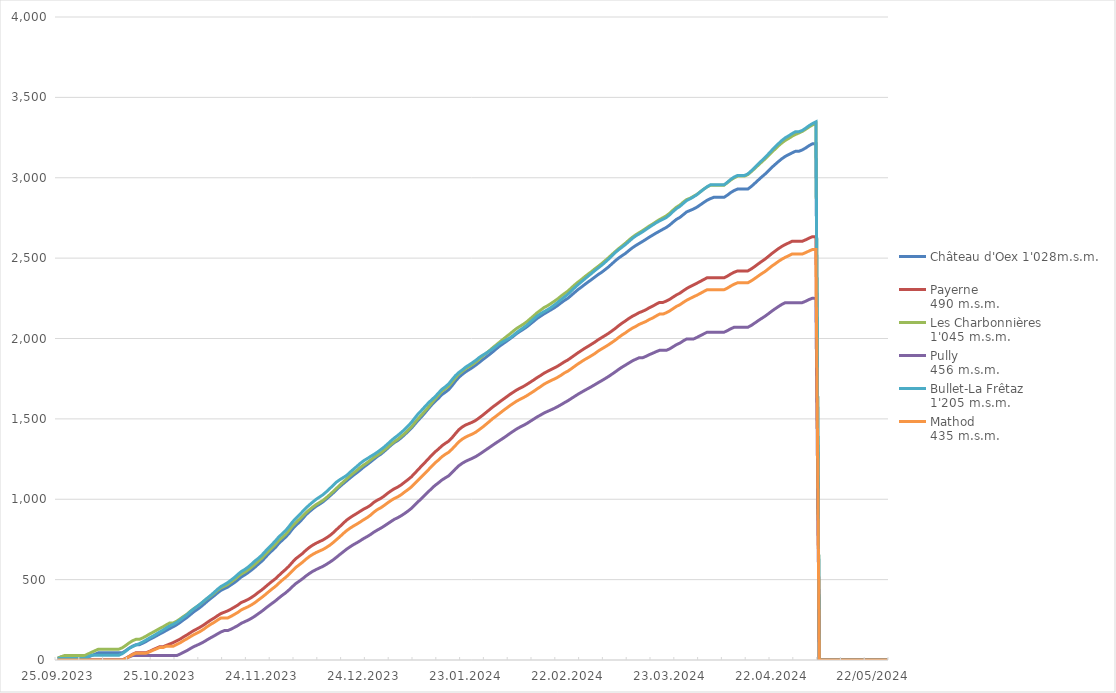
| Category | Château d'Oex 1'028m.s.m. | Payerne 
490 m.s.m. | Les Charbonnières 
1'045 m.s.m. | Pully 
456 m.s.m. | Bullet-La Frêtaz 
1'205 m.s.m. | Mathod 
435 m.s.m. |
|---|---|---|---|---|---|---|
| 25.09.2023 | 10.8 | 0 | 10.6 | 0 | 9.9 | 0 |
| 26.09.2023 | 19.4 | 0 | 19.9 | 0 | 9.9 | 0 |
| 27.09.2023 | 19.4 | 0 | 27.9 | 0 | 9.9 | 0 |
| 28.09.2023 | 19.4 | 0 | 27.9 | 0 | 9.9 | 0 |
| 29.09.2023 | 19.4 | 0 | 27.9 | 0 | 9.9 | 0 |
| 30.09.2023 | 19.4 | 0 | 27.9 | 0 | 9.9 | 0 |
| 01.10.2023 | 19.4 | 0 | 27.9 | 0 | 9.9 | 0 |
| 02.10.2023 | 19.4 | 0 | 27.9 | 0 | 9.9 | 0 |
| 03.10.2023 | 19.4 | 0 | 27.9 | 0 | 9.9 | 0 |
| 04.10.2023 | 19.4 | 0 | 38.4 | 0 | 20.1 | 0 |
| 05.10.2023 | 28.1 | 0 | 48.5 | 0 | 29.7 | 0 |
| 06.10.2023 | 36.7 | 0 | 58.1 | 0 | 29.7 | 0 |
| 07.10.2023 | 44.9 | 0 | 67.6 | 0 | 29.7 | 0 |
| 08.10.2023 | 44.9 | 0 | 67.6 | 0 | 29.7 | 0 |
| 09.10.2023 | 44.9 | 0 | 67.6 | 0 | 29.7 | 0 |
| 10.10.2023 | 44.9 | 0 | 67.6 | 0 | 29.7 | 0 |
| 11.10.2023 | 44.9 | 0 | 67.6 | 0 | 29.7 | 0 |
| 12.10.2023 | 44.9 | 0 | 67.6 | 0 | 29.7 | 0 |
| 13.10.2023 | 44.9 | 0 | 67.6 | 0 | 29.7 | 0 |
| 14.10.2023 | 44.9 | 0 | 76 | 0 | 39.4 | 0 |
| 15.10.2023 | 58.2 | 9.6 | 90.5 | 8.5 | 55 | 9 |
| 16.10.2023 | 73.2 | 22.5 | 106 | 19.1 | 71.7 | 20.8 |
| 17.10.2023 | 85.8 | 35.3 | 119.6 | 27.6 | 83.3 | 33.4 |
| 18.10.2023 | 95 | 45 | 128.4 | 27.6 | 92.9 | 42.3 |
| 19.10.2023 | 95 | 45 | 128.4 | 27.6 | 101.8 | 42.3 |
| 20.10.2023 | 104.3 | 45 | 137.3 | 27.6 | 112.2 | 42.3 |
| 21.10.2023 | 115.2 | 45 | 148.6 | 27.6 | 124.2 | 42.3 |
| 22.10.2023 | 128 | 53.7 | 161.3 | 27.6 | 137.3 | 50.9 |
| 23.10.2023 | 138.2 | 64.1 | 172.4 | 27.6 | 148.6 | 60.4 |
| 24.10.2023 | 149.7 | 73.2 | 184.1 | 27.6 | 161.2 | 68.8 |
| 25.10.2023 | 161.7 | 82.6 | 196.1 | 27.6 | 174.4 | 77.8 |
| 26.10.2023 | 172.6 | 82.6 | 206.7 | 27.6 | 186.3 | 77.8 |
| 27.10.2023 | 184.7 | 91.3 | 219.6 | 27.6 | 200.5 | 86 |
| 28.10.2023 | 196.2 | 99.8 | 230.9 | 27.6 | 212.7 | 86 |
| 29.10.2023 | 207.2 | 108.3 | 230.9 | 27.6 | 222.3 | 86 |
| 30.10.2023 | 219.2 | 119.4 | 241.4 | 27.6 | 234.1 | 96.4 |
| 31.10.2023 | 233.5 | 130.1 | 255.9 | 36.8 | 249.4 | 106.8 |
| 01.11.2023 | 249.7 | 143.5 | 270.9 | 47.8 | 265 | 120.1 |
| 02.11.2023 | 264.2 | 156 | 284.8 | 58.3 | 280.7 | 131.7 |
| 03.11.2023 | 281.8 | 169.6 | 302.9 | 70.9 | 299.9 | 144.8 |
| 04.11.2023 | 299.4 | 183.1 | 318.8 | 82.9 | 317.5 | 157.4 |
| 05.11.2023 | 313.8 | 193.9 | 333.1 | 92.2 | 333.1 | 167.6 |
| 06.11.2023 | 329.3 | 205.5 | 348.6 | 102.1 | 349.3 | 178.8 |
| 07.11.2023 | 347 | 218.7 | 366 | 113.3 | 367.3 | 192.4 |
| 08.11.2023 | 365.6 | 233.9 | 382.8 | 126.2 | 384.8 | 208 |
| 09.11.2023 | 382.7 | 248.2 | 397.8 | 138.4 | 402 | 221.9 |
| 10.11.2023 | 399.3 | 260.9 | 415 | 149.8 | 420.3 | 234 |
| 11.11.2023 | 417 | 275.2 | 433.6 | 162.3 | 440 | 248.1 |
| 12.11.2023 | 432.9 | 288.9 | 448.8 | 174.2 | 456.9 | 261.2 |
| 13.11.2023 | 443.8 | 297.2 | 459.2 | 182.8 | 468.9 | 261.2 |
| 14.11.2023 | 453.4 | 305.6 | 470 | 182.8 | 481.5 | 261.2 |
| 15.11.2023 | 467.7 | 316.9 | 485.5 | 192.1 | 497.5 | 271.8 |
| 16.11.2023 | 481.8 | 329.2 | 500.8 | 203 | 513.8 | 284.1 |
| 17.11.2023 | 498.4 | 342 | 518.5 | 214.4 | 532.8 | 296.3 |
| 18.11.2023 | 516.8 | 357.8 | 535.4 | 228.3 | 550.5 | 311.7 |
| 19.11.2023 | 529.4 | 366.4 | 546.7 | 238.2 | 562.7 | 321.8 |
| 20.11.2023 | 543.7 | 376.6 | 560.9 | 247.8 | 578.2 | 331.4 |
| 21.11.2023 | 560 | 389.2 | 577.7 | 259.4 | 596.2 | 343.2 |
| 22.11.2023 | 577.1 | 403.8 | 595.5 | 272.7 | 615.8 | 356.6 |
| 23.11.2023 | 596.2 | 420.6 | 614.4 | 287.9 | 632.4 | 373.1 |
| 24.11.2023 | 614.2 | 435.7 | 632.9 | 302.7 | 651.4 | 388.8 |
| 25.11.2023 | 636.1 | 453.4 | 655.1 | 319.5 | 674.6 | 405.6 |
| 26.11.2023 | 659.6 | 471.5 | 677 | 336.1 | 697.2 | 423.7 |
| 27.11.2023 | 679.6 | 488.5 | 697.6 | 351.7 | 718.3 | 441 |
| 28.11.2023 | 699.2 | 504.9 | 718.4 | 367.1 | 740.3 | 457.1 |
| 29.11.2023 | 724.5 | 524.8 | 742.7 | 385 | 764.8 | 476.9 |
| 30.11.2023 | 744.4 | 544.5 | 761.8 | 401.7 | 784.6 | 495.8 |
| 01.12.2023 | 763.8 | 562.9 | 781.2 | 417.1 | 804.6 | 513.1 |
| 02.12.2023 | 786.1 | 583.2 | 805.1 | 435.5 | 829.7 | 532 |
| 03.12.2023 | 813.9 | 607.4 | 832.7 | 455.8 | 857.2 | 554.1 |
| 04.12.2023 | 836.8 | 629.8 | 854 | 474.9 | 880.5 | 575.4 |
| 05.12.2023 | 856 | 646.1 | 873.7 | 489.9 | 901.4 | 591.6 |
| 06.12.2023 | 878.1 | 662.5 | 894 | 505.1 | 923.1 | 608.1 |
| 07.12.2023 | 902.9 | 682.7 | 916.1 | 522.4 | 945.3 | 626.7 |
| 08.12.2023 | 922.1 | 700 | 934.1 | 537.8 | 964.3 | 643.3 |
| 09.12.2023 | 939.8 | 714.5 | 951.2 | 551.4 | 982.5 | 656.9 |
| 10.12.2023 | 956.4 | 726.6 | 966.9 | 562.6 | 999.4 | 668.4 |
| 11.12.2023 | 969 | 736.8 | 979.6 | 572.7 | 1013.8 | 678.1 |
| 12.12.2023 | 983.4 | 746.4 | 992.3 | 582.4 | 1028 | 687.4 |
| 13.12.2023 | 1000.9 | 759.5 | 1009.4 | 594.7 | 1046.2 | 699.8 |
| 14.12.2023 | 1019.5 | 773.7 | 1028.2 | 608.2 | 1065.9 | 713.6 |
| 15.12.2023 | 1038.6 | 790.9 | 1047.7 | 622.6 | 1086.6 | 730.3 |
| 16.12.2023 | 1059.8 | 811.3 | 1067.9 | 639.3 | 1106.9 | 748.8 |
| 17.12.2023 | 1079.1 | 830.7 | 1087.8 | 656.5 | 1122 | 767.3 |
| 18.12.2023 | 1097.2 | 850.9 | 1108 | 673.1 | 1134.9 | 787 |
| 19.12.2023 | 1114.7 | 870.5 | 1127 | 689.8 | 1148.5 | 805.2 |
| 20.12.2023 | 1132.5 | 885.7 | 1146 | 704.4 | 1168.4 | 820.2 |
| 21.12.2023 | 1149.6 | 899.4 | 1163.4 | 717.8 | 1186.8 | 833.6 |
| 22.12.2023 | 1165.4 | 912.1 | 1179.9 | 729.5 | 1204.6 | 845.7 |
| 23.12.2023 | 1182.4 | 925.7 | 1197.8 | 742.3 | 1223.5 | 858.9 |
| 24.12.2023 | 1200.4 | 938.6 | 1213 | 755.9 | 1239.6 | 872.8 |
| 25.12.2023 | 1215.5 | 949.3 | 1227.3 | 767.5 | 1252.3 | 885.6 |
| 26.12.2023 | 1232.3 | 962.7 | 1243.7 | 780.5 | 1266.2 | 901 |
| 27.12.2023 | 1249.1 | 981.1 | 1260.4 | 795.5 | 1278.9 | 919.9 |
| 28.12.2023 | 1265.9 | 994.1 | 1274.2 | 808.2 | 1292.6 | 935.4 |
| 29.12.2023 | 1279.7 | 1005.2 | 1288.6 | 819.8 | 1308.3 | 946.8 |
| 30.12.2023 | 1297.2 | 1019.4 | 1305.5 | 832.9 | 1324.7 | 961.1 |
| 31.12.2023 | 1315.8 | 1036.7 | 1322.5 | 847.1 | 1343.3 | 977 |
| 01.01.2024 | 1335.6 | 1051.6 | 1341.5 | 861.2 | 1362.9 | 991.8 |
| 02.01.2024 | 1352.3 | 1065.4 | 1358.4 | 875.1 | 1380.9 | 1004.8 |
| 03.01.2024 | 1365.2 | 1075.8 | 1373.1 | 885.1 | 1396.7 | 1014.7 |
| 04.01.2024 | 1381.7 | 1089.1 | 1390.5 | 897.1 | 1414.8 | 1028 |
| 05.01.2024 | 1400.9 | 1105.5 | 1408.3 | 911 | 1433.5 | 1044.3 |
| 06.01.2024 | 1421 | 1121.7 | 1428.6 | 926.1 | 1455 | 1059.7 |
| 07.01.2024 | 1441.4 | 1139.2 | 1449.7 | 942.7 | 1477.3 | 1076.1 |
| 08.01.2024 | 1466 | 1161.4 | 1475.6 | 963.9 | 1504.5 | 1097.6 |
| 09.01.2024 | 1490.8 | 1184 | 1501.4 | 984.7 | 1531.1 | 1119.4 |
| 10.01.2024 | 1512.9 | 1206.6 | 1524 | 1004.4 | 1552.8 | 1140.5 |
| 11.01.2024 | 1537.1 | 1228.4 | 1548.7 | 1025.2 | 1576.1 | 1161.2 |
| 12.01.2024 | 1562.8 | 1251 | 1572.4 | 1046.4 | 1598.6 | 1182.7 |
| 13.01.2024 | 1587 | 1273.4 | 1598.6 | 1067 | 1619.2 | 1205.3 |
| 14.01.2024 | 1608.7 | 1294.7 | 1624.2 | 1086.5 | 1637.8 | 1226.7 |
| 15.01.2024 | 1628.7 | 1312.2 | 1646.9 | 1102.4 | 1661.3 | 1244.2 |
| 16.01.2024 | 1650.9 | 1332.5 | 1672.2 | 1119.7 | 1683.8 | 1264.3 |
| 17.01.2024 | 1665.7 | 1347.8 | 1687 | 1133 | 1699.6 | 1279.5 |
| 18.01.2024 | 1682.1 | 1361.3 | 1704 | 1145.9 | 1718 | 1292.2 |
| 19.01.2024 | 1706.8 | 1383.3 | 1729.4 | 1166.5 | 1744.5 | 1312.2 |
| 20.01.2024 | 1734.5 | 1408.7 | 1755.4 | 1189 | 1769.4 | 1334.8 |
| 21.01.2024 | 1758.5 | 1432.9 | 1779.3 | 1208.7 | 1788.7 | 1357.3 |
| 22.01.2024 | 1776.8 | 1449.7 | 1795.6 | 1223.9 | 1804.5 | 1374.2 |
| 23.01.2024 | 1793.1 | 1462.4 | 1812.5 | 1236.2 | 1822.1 | 1386.9 |
| 24.01.2024 | 1806.1 | 1470.9 | 1825.4 | 1245.8 | 1835.7 | 1396.9 |
| 25.01.2024 | 1819.9 | 1479.8 | 1838.7 | 1255.1 | 1849.9 | 1406 |
| 26.01.2024 | 1835.1 | 1491.3 | 1854 | 1266.1 | 1864.8 | 1417.9 |
| 27.01.2024 | 1851.2 | 1506.7 | 1872.2 | 1279.2 | 1882.4 | 1433.4 |
| 28.01.2024 | 1868.3 | 1522.7 | 1890.6 | 1293.6 | 1896 | 1449 |
| 29.01.2024 | 1884.2 | 1540 | 1907.3 | 1308.2 | 1908.6 | 1466.5 |
| 30.01.2024 | 1900.6 | 1557.3 | 1925.2 | 1322.5 | 1922.3 | 1484.1 |
| 31.01.2024 | 1917.6 | 1574.7 | 1943.7 | 1337.3 | 1936.5 | 1502.5 |
| 01.02.2024 | 1935.6 | 1589.9 | 1960.7 | 1351.7 | 1952.8 | 1518 |
| 02.02.2024 | 1952.9 | 1606 | 1978 | 1365.5 | 1968.5 | 1534.6 |
| 03.02.2024 | 1967.8 | 1621.4 | 1995.4 | 1379.3 | 1980.4 | 1551 |
| 04.02.2024 | 1982.7 | 1636.6 | 2012 | 1393.8 | 1992.2 | 1566.6 |
| 05.02.2024 | 1997.8 | 1652.3 | 2028.5 | 1409.3 | 2003.8 | 1582.3 |
| 06.02.2024 | 2013.6 | 1666.1 | 2046.5 | 1423.3 | 2019.4 | 1596.7 |
| 07.02.2024 | 2030.7 | 1679.9 | 2062.8 | 1437.4 | 2037.4 | 1610.6 |
| 08.02.2024 | 2044.7 | 1691.2 | 2076.1 | 1449.2 | 2052.6 | 1621.9 |
| 09.02.2024 | 2058.2 | 1702 | 2089.4 | 1459.7 | 2067.4 | 1632.5 |
| 10.02.2024 | 2072.8 | 1714.7 | 2104.6 | 1471.5 | 2083.1 | 1644.5 |
| 11.02.2024 | 2089.8 | 1728.4 | 2123 | 1485.1 | 2102.6 | 1658.1 |
| 12.02.2024 | 2106.9 | 1742 | 2141.2 | 1498.5 | 2121.5 | 1671.5 |
| 13.02.2024 | 2124.5 | 1756.8 | 2159.9 | 1512 | 2139.8 | 1686.4 |
| 14.02.2024 | 2138.9 | 1769.5 | 2175.7 | 1523.7 | 2153.7 | 1700.2 |
| 15.02.2024 | 2152.7 | 1783.8 | 2192 | 1535.8 | 2166.4 | 1715.4 |
| 16.02.2024 | 2165 | 1795 | 2203.1 | 1545.9 | 2178 | 1726.7 |
| 17.02.2024 | 2177.7 | 1806 | 2216.6 | 1555.2 | 2191.8 | 1737.6 |
| 18.02.2024 | 2190.1 | 1816.3 | 2230.8 | 1564.8 | 2207 | 1747.4 |
| 19.02.2024 | 2204.6 | 1827.4 | 2245.6 | 1575.7 | 2223.1 | 1758.1 |
| 20.02.2024 | 2221.1 | 1840.7 | 2262.9 | 1587.7 | 2241.5 | 1770.7 |
| 21.02.2024 | 2236.3 | 1854.4 | 2278.9 | 1600.4 | 2257.6 | 1785.4 |
| 22.02.2024 | 2249.4 | 1866 | 2294 | 1612.1 | 2274.3 | 1796.4 |
| 23.02.2024 | 2267.3 | 1880.7 | 2313.3 | 1625.9 | 2294.7 | 1810.9 |
| 24.02.2024 | 2285.9 | 1895.7 | 2332.6 | 1639.4 | 2314.9 | 1826.3 |
| 25.02.2024 | 2303.9 | 1910.9 | 2350.3 | 1653 | 2334.1 | 1841.6 |
| 26.02.2024 | 2319.3 | 1924.6 | 2366.3 | 1665.3 | 2352 | 1855.3 |
| 27.02.2024 | 2335.9 | 1938.7 | 2384 | 1677.3 | 2369.9 | 1869 |
| 28.02.2024 | 2351.6 | 1951.3 | 2400.4 | 1688.8 | 2387.7 | 1880.8 |
| 29.02.2024 | 2366.5 | 1964.4 | 2416.1 | 1700.6 | 2404.9 | 1893.3 |
| 01.03.2024 | 2382.6 | 1977.8 | 2433.5 | 1713 | 2422.7 | 1906.5 |
| 02.03.2024 | 2398.4 | 1992.9 | 2449.3 | 1725.7 | 2439.6 | 1922.3 |
| 03.03.2024 | 2412.1 | 2005.7 | 2466.2 | 1737.6 | 2455.7 | 1935.3 |
| 04.03.2024 | 2428.4 | 2018.6 | 2484.2 | 1750.4 | 2474.3 | 1947.8 |
| 05.03.2024 | 2445.3 | 2032 | 2502.6 | 1763.5 | 2493.5 | 1961 |
| 06.03.2024 | 2464.3 | 2046.8 | 2522 | 1777.8 | 2514 | 1975.2 |
| 07.03.2024 | 2483.4 | 2062.6 | 2540.8 | 1792.4 | 2534.8 | 1990 |
| 08.03.2024 | 2500.8 | 2080 | 2559.4 | 1808 | 2552.6 | 2006.7 |
| 09.03.2024 | 2515.3 | 2095.5 | 2576.1 | 1822.1 | 2568.5 | 2022.1 |
| 10.03.2024 | 2529.4 | 2109.7 | 2593.3 | 1834.6 | 2585.1 | 2035.5 |
| 11.03.2024 | 2547.1 | 2124.7 | 2612.2 | 1847.8 | 2603.5 | 2050.9 |
| 12.03.2024 | 2563.8 | 2138 | 2629.7 | 1860.4 | 2622.2 | 2064 |
| 13.03.2024 | 2578.3 | 2148.9 | 2644.8 | 1870.7 | 2637.9 | 2075 |
| 14.03.2024 | 2590.9 | 2160.8 | 2658.1 | 1879.9 | 2650.4 | 2087.5 |
| 15.03.2024 | 2603.5 | 2169 | 2670.8 | 1879.9 | 2663.2 | 2096.8 |
| 16.03.2024 | 2616.7 | 2178.7 | 2685.1 | 1888.9 | 2677.9 | 2105.8 |
| 17.03.2024 | 2630.5 | 2191.2 | 2699.7 | 1899.5 | 2692.2 | 2118.2 |
| 18.03.2024 | 2643.1 | 2201.3 | 2712.3 | 1908.4 | 2705.9 | 2127.4 |
| 19.03.2024 | 2655.8 | 2213.4 | 2726.5 | 1918 | 2719.7 | 2140.1 |
| 20.03.2024 | 2667.7 | 2224.4 | 2739.8 | 1926.4 | 2731.2 | 2151.7 |
| 21.03.2024 | 2679.4 | 2224.4 | 2751.2 | 1926.4 | 2741.9 | 2151.7 |
| 22.03.2024 | 2691 | 2232.7 | 2763.3 | 1926.4 | 2752.8 | 2160.3 |
| 23.03.2024 | 2705.9 | 2243.5 | 2779.5 | 1935.8 | 2769.5 | 2171.5 |
| 24.03.2024 | 2724.3 | 2257.6 | 2799 | 1948.8 | 2790 | 2185.7 |
| 25.03.2024 | 2741.5 | 2271.4 | 2817 | 1961.9 | 2808.5 | 2199.9 |
| 26.03.2024 | 2753.2 | 2282 | 2830.1 | 1971.5 | 2821.9 | 2210.1 |
| 27.03.2024 | 2770.4 | 2297.1 | 2848.4 | 1985.6 | 2840.9 | 2224.7 |
| 28.03.2024 | 2787.7 | 2311.2 | 2864.3 | 1997.1 | 2858.3 | 2238.1 |
| 29.03.2024 | 2796.6 | 2322.9 | 2872.5 | 1997.1 | 2868.9 | 2249.1 |
| 30.03.2024 | 2805.6 | 2333.4 | 2884.5 | 1997.1 | 2881.1 | 2259.4 |
| 31.03.2024 | 2817 | 2344 | 2896.7 | 2006.6 | 2894.6 | 2269.3 |
| 01.04.2024 | 2831.3 | 2355.1 | 2912.9 | 2017.7 | 2911.9 | 2280.5 |
| 02.04.2024 | 2846.1 | 2366.6 | 2929 | 2028.6 | 2928.5 | 2292.2 |
| 03.04.2024 | 2860 | 2377.8 | 2943 | 2039.2 | 2944.1 | 2303.5 |
| 04.04.2024 | 2870.3 | 2377.8 | 2954 | 2039.2 | 2956.1 | 2303.5 |
| 05.04.2024 | 2878.5 | 2377.8 | 2954 | 2039.2 | 2956.1 | 2303.5 |
| 06.04.2024 | 2878.5 | 2377.8 | 2954 | 2039.2 | 2956.1 | 2303.5 |
| 07.04.2024 | 2878.5 | 2377.8 | 2954 | 2039.2 | 2956.1 | 2303.5 |
| 08.04.2024 | 2878.5 | 2377.8 | 2954 | 2039.2 | 2956.1 | 2303.5 |
| 09.04.2024 | 2892.2 | 2388.6 | 2969.8 | 2049.4 | 2972.6 | 2313.9 |
| 10.04.2024 | 2908.5 | 2401.7 | 2986.7 | 2060.9 | 2990.7 | 2326.9 |
| 11.04.2024 | 2920.9 | 2412.4 | 2999.9 | 2070.2 | 3005 | 2338 |
| 12.04.2024 | 2930 | 2420.6 | 3010.3 | 2070.2 | 3014.5 | 2346.8 |
| 13.04.2024 | 2930 | 2420.6 | 3010.3 | 2070.2 | 3014.5 | 2346.8 |
| 14.04.2024 | 2930 | 2420.6 | 3010.3 | 2070.2 | 3014.5 | 2346.8 |
| 15.04.2024 | 2930 | 2420.6 | 3020 | 2070.2 | 3024 | 2346.8 |
| 16.04.2024 | 2945.7 | 2432.9 | 3037.9 | 2081.6 | 3043 | 2358.8 |
| 17.04.2024 | 2964.8 | 2447.6 | 3057.3 | 2095.8 | 3063.6 | 2372.9 |
| 18.04.2024 | 2984.4 | 2463.4 | 3077.3 | 2110.5 | 3085 | 2387.9 |
| 19.04.2024 | 3003.7 | 2478.7 | 3096.9 | 2124.4 | 3105 | 2402.8 |
| 20.04.2024 | 3021.9 | 2493.2 | 3116 | 2138.2 | 3125.4 | 2416.1 |
| 21.04.2024 | 3042.4 | 2510.1 | 3136.7 | 2153.5 | 3147.2 | 2432.6 |
| 22.04.2024 | 3063.7 | 2527.7 | 3158.4 | 2169.8 | 3170 | 2449.7 |
| 23.04.2024 | 3082.6 | 2543.8 | 3178.3 | 2184.8 | 3191.4 | 2464.4 |
| 24.04.2024 | 3101.1 | 2559.3 | 3198.9 | 2199 | 3212.4 | 2479.7 |
| 25.04.2024 | 3118.5 | 2573.2 | 3217.1 | 2212.3 | 3232 | 2493.5 |
| 26.04.2024 | 3133 | 2584.8 | 3232.5 | 2223.1 | 3248.5 | 2505 |
| 27.04.2024 | 3144.1 | 2594.5 | 3244.6 | 2223.1 | 3260.8 | 2515 |
| 28.04.2024 | 3155 | 2605 | 3258.4 | 2223.1 | 3274.6 | 2525.5 |
| 29.04.2024 | 3164.7 | 2605 | 3269.3 | 2223.1 | 3286.4 | 2525.5 |
| 30.04.2024 | 3164.7 | 2605 | 3278.6 | 2223.1 | 3286.4 | 2525.5 |
| 01.05.2024 | 3173.2 | 2605 | 3288.4 | 2223.1 | 3294.4 | 2525.5 |
| 02.05.2024 | 3185.3 | 2614 | 3301.7 | 2232 | 3308.4 | 2534.5 |
| 03.05.2024 | 3199.8 | 2624.5 | 3316.2 | 2242.3 | 3324 | 2544.4 |
| 04.05.2024 | 3211.3 | 2633.6 | 3328.5 | 2250.8 | 3337.1 | 2553.7 |
| 05.05.2024 | 3211.3 | 2633.6 | 3337.4 | 2250.8 | 3347.8 | 2553.7 |
| 06/05/2024 | 0 | 0 | 0 | 0 | 0 | 0 |
| 07/05/2024 | 0 | 0 | 0 | 0 | 0 | 0 |
| 08/05/2024 | 0 | 0 | 0 | 0 | 0 | 0 |
| 09/05/2024 | 0 | 0 | 0 | 0 | 0 | 0 |
| 10/05/2024 | 0 | 0 | 0 | 0 | 0 | 0 |
| 11/05/2024 | 0 | 0 | 0 | 0 | 0 | 0 |
| 12/05/2024 | 0 | 0 | 0 | 0 | 0 | 0 |
| 13/05/2024 | 0 | 0 | 0 | 0 | 0 | 0 |
| 14/05/2024 | 0 | 0 | 0 | 0 | 0 | 0 |
| 15/05/2024 | 0 | 0 | 0 | 0 | 0 | 0 |
| 16/05/2024 | 0 | 0 | 0 | 0 | 0 | 0 |
| 17/05/2024 | 0 | 0 | 0 | 0 | 0 | 0 |
| 18/05/2024 | 0 | 0 | 0 | 0 | 0 | 0 |
| 19/05/2024 | 0 | 0 | 0 | 0 | 0 | 0 |
| 20/05/2024 | 0 | 0 | 0 | 0 | 0 | 0 |
| 21/05/2024 | 0 | 0 | 0 | 0 | 0 | 0 |
| 22/05/2024 | 0 | 0 | 0 | 0 | 0 | 0 |
| 23/05/2024 | 0 | 0 | 0 | 0 | 0 | 0 |
| 24/05/2024 | 0 | 0 | 0 | 0 | 0 | 0 |
| 25/05/2024 | 0 | 0 | 0 | 0 | 0 | 0 |
| 26/05/2024 | 0 | 0 | 0 | 0 | 0 | 0 |